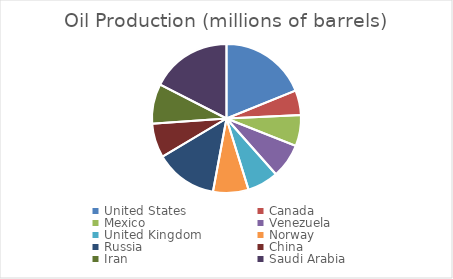
| Category | Oil Production (millions of barrels) |
|---|---|
| United States | 8.1 |
| Canada | 2.3 |
| Mexico | 2.9 |
| Venezuela | 3.2 |
| United Kingdom | 2.9 |
| Norway | 3.3 |
| Russia | 5.8 |
| China | 3.2 |
| Iran | 3.7 |
| Saudi Arabia | 7.5 |